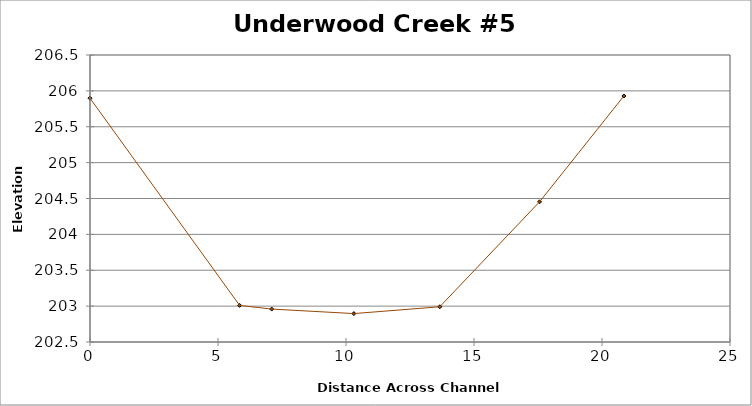
| Category | Series 0 |
|---|---|
| 0.0 | 205.898 |
| 5.843672561422022 | 203.01 |
| 7.09840862442022 | 202.959 |
| 10.306551169340882 | 202.896 |
| 13.663103307864365 | 202.991 |
| 17.561000113829458 | 204.454 |
| 20.855965094195184 | 205.929 |